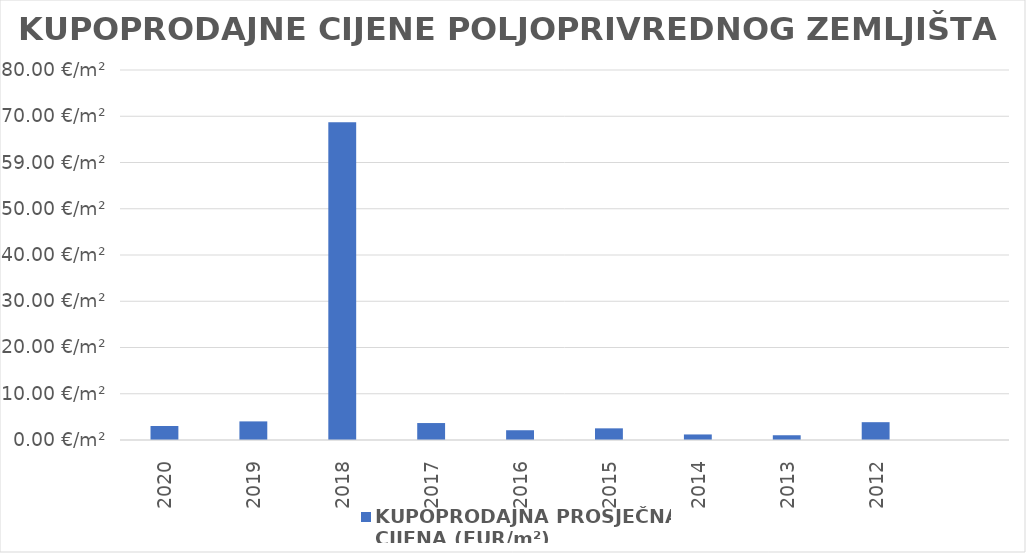
| Category | KUPOPRODAJNA PROSJEČNA 
CIJENA (EUR/m²) |
|---|---|
| 2020 | 1900-01-03 00:31:39 |
| 2019 | 1900-01-04 00:34:28 |
| 2018 | 1900-03-08 16:55:31 |
| 2017 | 1900-01-03 15:59:21 |
| 2016 | 1900-01-02 02:39:48 |
| 2015 | 1900-01-02 12:31:04 |
| 2014 | 1900-01-01 04:46:42 |
| 2013 | 1900-01-01 00:38:54 |
| 2012 | 1900-01-03 20:26:42 |